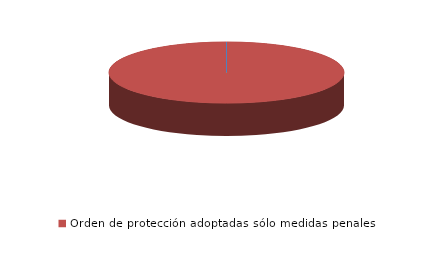
| Category | Series 0 |
|---|---|
| Orden de protección denegadas | 0 |
| Orden de protección adoptadas sólo medidas penales | 16 |
| Orden de protección adoptadas medidas penales y civiles | 0 |